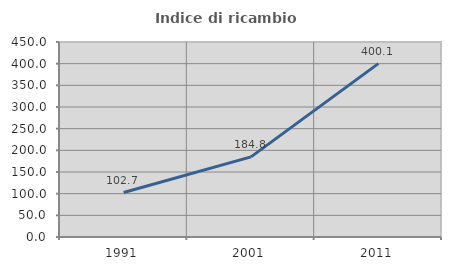
| Category | Indice di ricambio occupazionale  |
|---|---|
| 1991.0 | 102.661 |
| 2001.0 | 184.829 |
| 2011.0 | 400.121 |